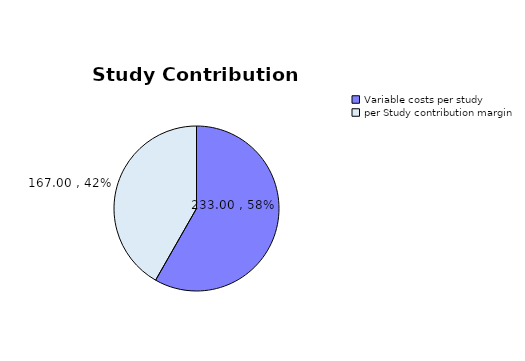
| Category | Series 0 |
|---|---|
| Variable costs per study | 233 |
| per Study contribution margin | 167 |